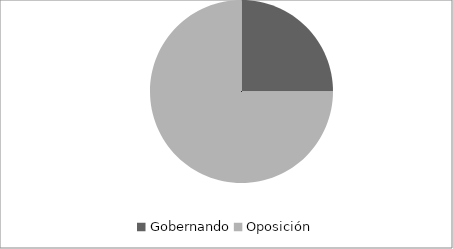
| Category | Series 0 |
|---|---|
| Gobernando | 16 |
| Oposición | 48 |